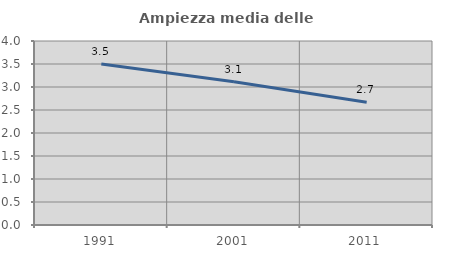
| Category | Ampiezza media delle famiglie |
|---|---|
| 1991.0 | 3.502 |
| 2001.0 | 3.114 |
| 2011.0 | 2.666 |